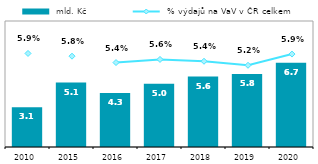
| Category |  mld. Kč |
|---|---|
| 2010.0 | 3.147 |
| 2015.0 | 5.112 |
| 2016.0 | 4.295 |
| 2017.0 | 5.024 |
| 2018.0 | 5.594 |
| 2019.0 | 5.791 |
| 2020.0 | 6.691 |